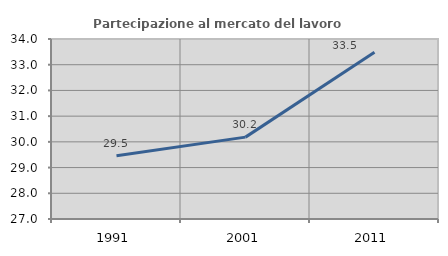
| Category | Partecipazione al mercato del lavoro  femminile |
|---|---|
| 1991.0 | 29.459 |
| 2001.0 | 30.184 |
| 2011.0 | 33.481 |